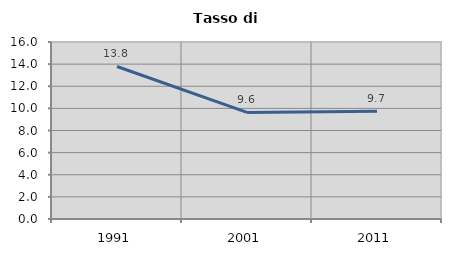
| Category | Tasso di disoccupazione   |
|---|---|
| 1991.0 | 13.788 |
| 2001.0 | 9.632 |
| 2011.0 | 9.734 |